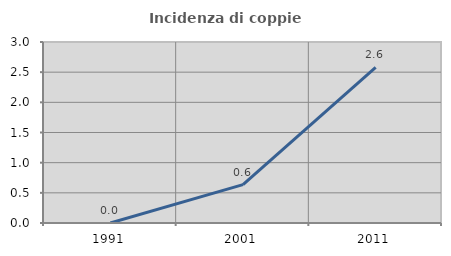
| Category | Incidenza di coppie miste |
|---|---|
| 1991.0 | 0 |
| 2001.0 | 0.636 |
| 2011.0 | 2.579 |